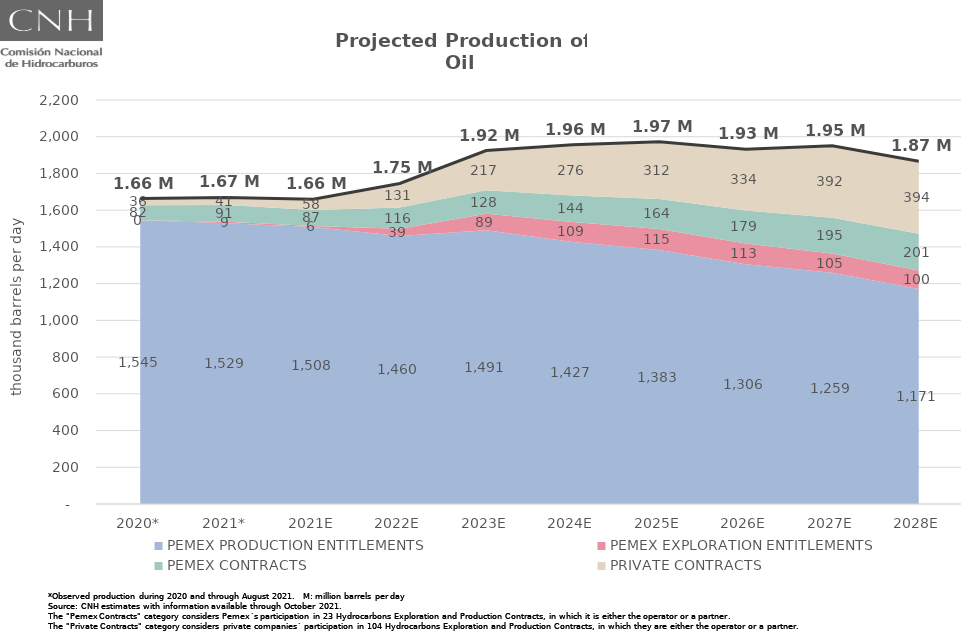
| Category | Total |
|---|---|
| 2020* | 1663.042 |
| 2021* | 1669.616 |
| 2021E | 1659.014 |
| 2022E | 1745.525 |
| 2023E | 1924.769 |
| 2024E | 1956.201 |
| 2025E | 1973.022 |
| 2026E | 1931.653 |
| 2027E | 1950.433 |
| 2028E | 1866.164 |